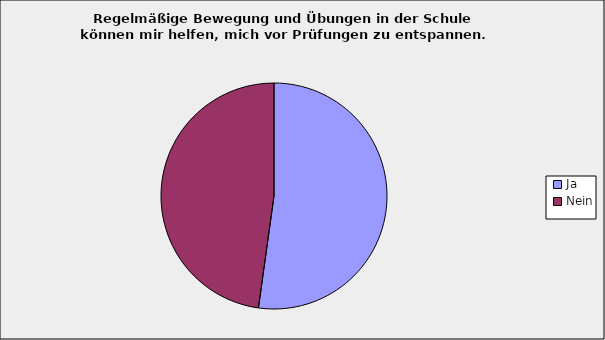
| Category | Series 0 |
|---|---|
| Ja | 0.522 |
| Nein | 0.478 |